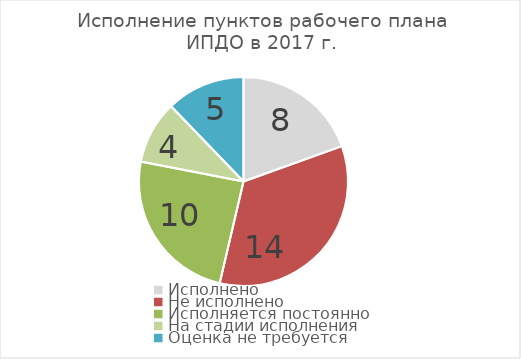
| Category | Исполнение пунктов рабочего плана ИПДО |
|---|---|
| Исполнено | 8 |
| Не исполнено | 14 |
| Исполняется постоянно | 10 |
| На стадии исполнения | 4 |
| Оценка не требуется | 5 |